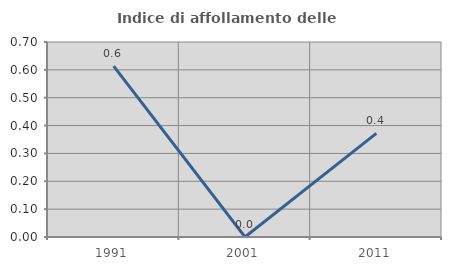
| Category | Indice di affollamento delle abitazioni  |
|---|---|
| 1991.0 | 0.613 |
| 2001.0 | 0 |
| 2011.0 | 0.372 |